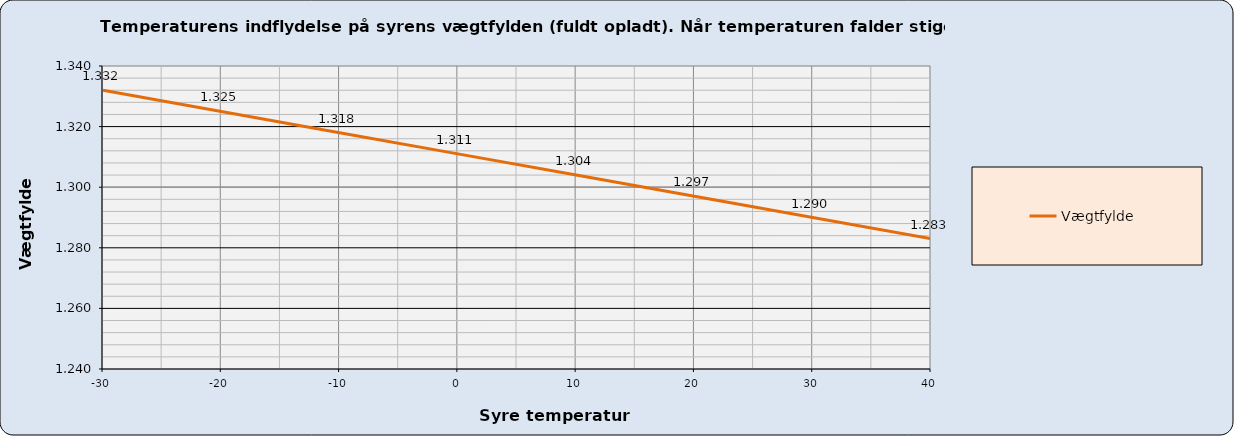
| Category | Vægtfylde  |
|---|---|
| -30.0 | 1.332 |
| -20.0 | 1.325 |
| -10.0 | 1.318 |
| 0.0 | 1.311 |
| 10.0 | 1.304 |
| 20.0 | 1.297 |
| 30.0 | 1.29 |
| 40.0 | 1.283 |